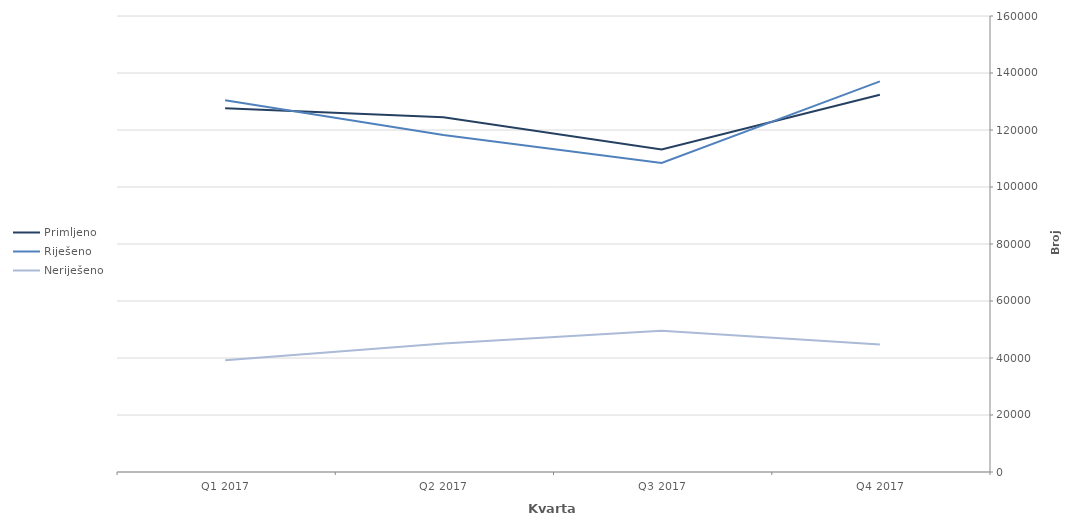
| Category | Primljeno | Riješeno | Neriješeno |
|---|---|---|---|
| Q4 2017 | 132355 | 137077 | 44709 |
| Q3 2017 | 113148 | 108417 | 49599 |
| Q2 2017 | 124462 | 118235 | 45130 |
| Q1 2017 | 127612 | 130452 | 39207 |